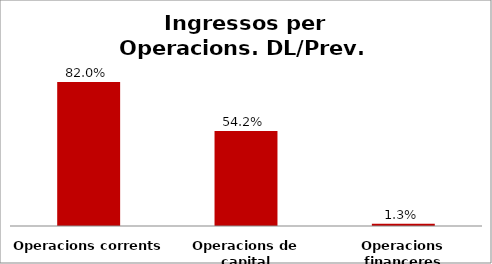
| Category | Series 0 |
|---|---|
| Operacions corrents | 0.82 |
| Operacions de capital | 0.542 |
| Operacions financeres | 0.013 |